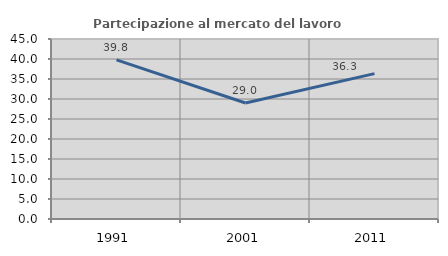
| Category | Partecipazione al mercato del lavoro  femminile |
|---|---|
| 1991.0 | 39.763 |
| 2001.0 | 29.002 |
| 2011.0 | 36.336 |